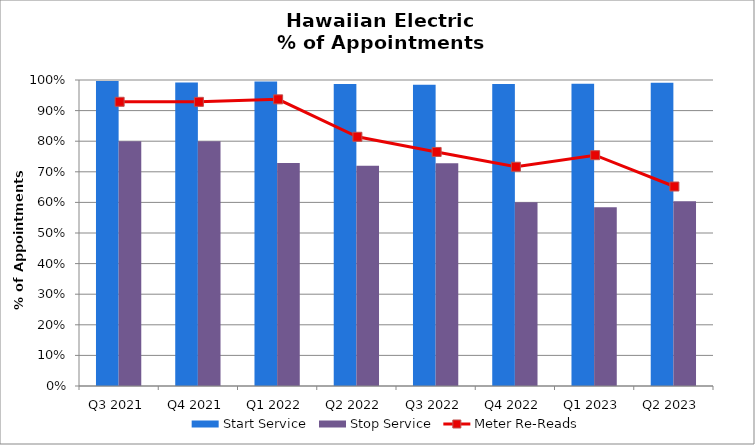
| Category | Start Service | Stop Service |
|---|---|---|
| Q3 2021 | 0.997 | 0.8 |
| Q4 2021 | 0.992 | 0.8 |
| Q1 2022 | 0.995 | 0.729 |
| Q2 2022 | 0.987 | 0.72 |
| Q3 2022 | 0.984 | 0.728 |
| Q4 2022 | 0.987 | 0.6 |
| Q1 2023 | 0.987 | 0.584 |
| Q2 2023 | 0.991 | 0.604 |